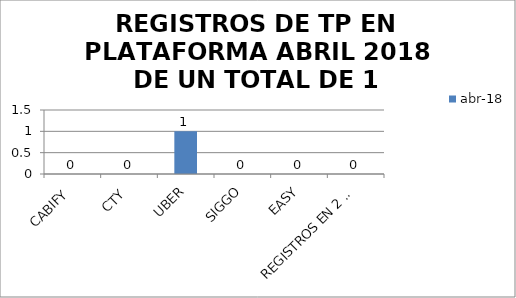
| Category | abr-18 |
|---|---|
| CABIFY | 0 |
| CTY | 0 |
| UBER | 1 |
| SIGGO | 0 |
| EASY | 0 |
| REGISTROS EN 2 O MAS PLATAFORMAS | 0 |